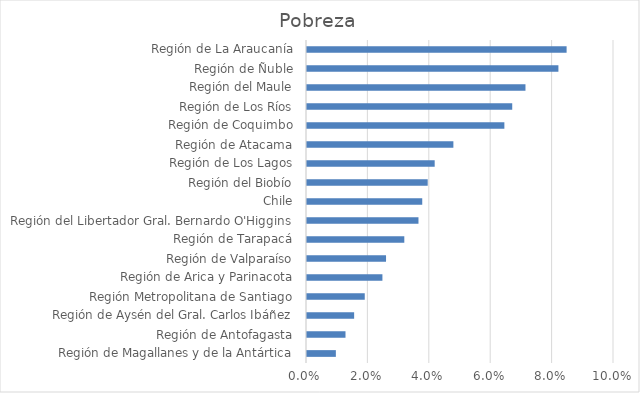
| Category | Pobreza |
|---|---|
| Región de Magallanes y de la Antártica | 0.009 |
| Región de Antofagasta | 0.013 |
| Región de Aysén del Gral. Carlos Ibáñez | 0.015 |
| Región Metropolitana de Santiago | 0.019 |
| Región de Arica y Parinacota | 0.025 |
| Región de Valparaíso | 0.026 |
| Región de Tarapacá | 0.032 |
| Región del Libertador Gral. Bernardo O'Higgins | 0.036 |
| Chile | 0.038 |
| Región del Biobío | 0.039 |
| Región de Los Lagos | 0.042 |
| Región de Atacama | 0.048 |
| Región de Coquimbo | 0.064 |
| Región de Los Ríos | 0.067 |
| Región del Maule | 0.071 |
| Región de Ñuble | 0.082 |
| Región de La Araucanía | 0.085 |